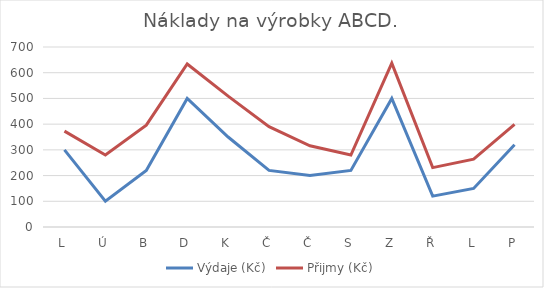
| Category | Výdaje (Kč) | Přijmy (Kč) |
|---|---|---|
| L | 300 | 373 |
| Ú | 100 | 280 |
| B | 220 | 396 |
| D | 500 | 634 |
| K | 350 | 509 |
| Č | 220 | 390 |
| Č | 200 | 316 |
| S | 220 | 280 |
| Z | 500 | 637 |
| Ř | 120 | 231 |
| L | 150 | 264 |
| P | 320 | 399 |